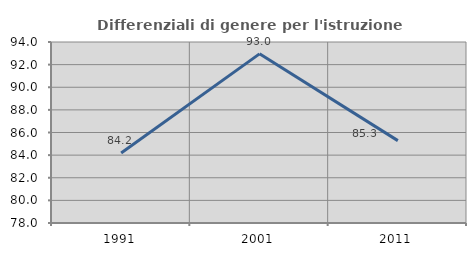
| Category | Differenziali di genere per l'istruzione superiore |
|---|---|
| 1991.0 | 84.193 |
| 2001.0 | 92.953 |
| 2011.0 | 85.281 |